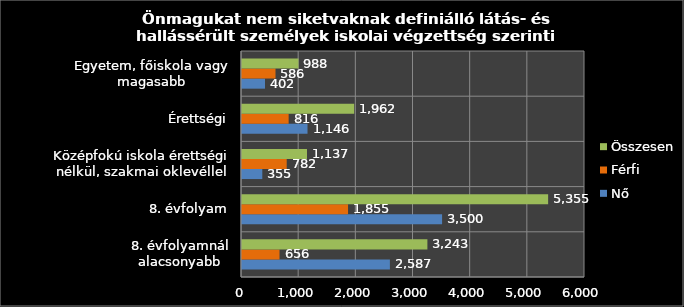
| Category | Nő | Férfi | Összesen |
|---|---|---|---|
| 8. évfolyamnál alacsonyabb | 2587 | 656 | 3243 |
| 8. évfolyam | 3500 | 1855 | 5355 |
| Középfokú iskola érettségi nélkül, szakmai oklevéllel | 355 | 782 | 1137 |
| Érettségi | 1146 | 816 | 1962 |
| Egyetem, főiskola vagy magasabb | 402 | 586 | 988 |